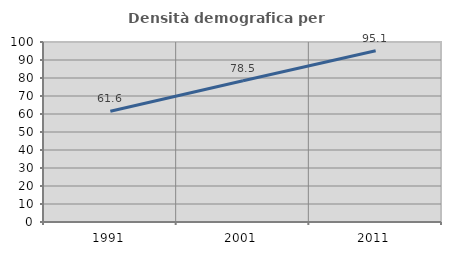
| Category | Densità demografica |
|---|---|
| 1991.0 | 61.55 |
| 2001.0 | 78.486 |
| 2011.0 | 95.118 |